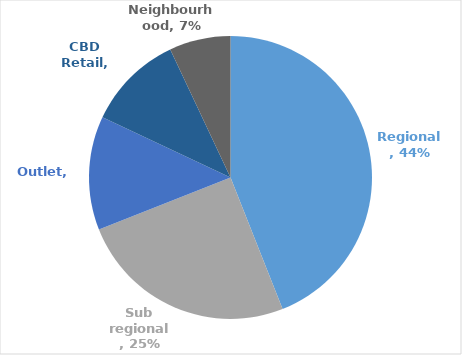
| Category | Series 0 |
|---|---|
| Regional | 0.44 |
| Sub regional | 0.25 |
| Outlet | 0.13 |
| CBD Retail | 0.11 |
| Neighbourhood | 0.07 |